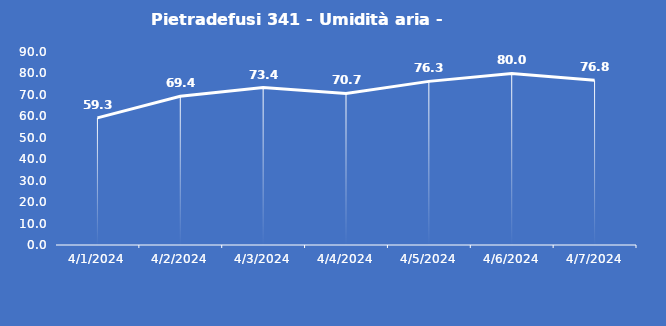
| Category | Pietradefusi 341 - Umidità aria - Grezzo (%) |
|---|---|
| 4/1/24 | 59.3 |
| 4/2/24 | 69.4 |
| 4/3/24 | 73.4 |
| 4/4/24 | 70.7 |
| 4/5/24 | 76.3 |
| 4/6/24 | 80 |
| 4/7/24 | 76.8 |